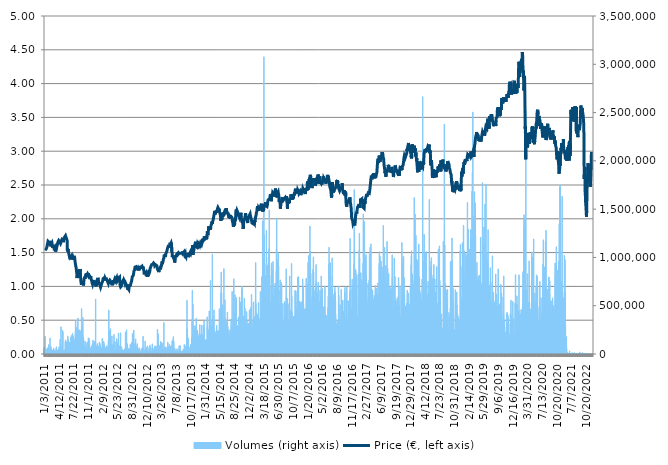
| Category | Volumes (right axis) |
|---|---|
| 1/3/11 | 57810.176 |
| 1/4/11 | 41521.826 |
| 1/5/11 | 73502.117 |
| 1/6/11 | 15096.544 |
| 1/7/11 | 47100.125 |
| 1/10/11 | 59739.139 |
| 1/11/11 | 182088.08 |
| 1/12/11 | 23761.185 |
| 1/13/11 | 38979.239 |
| 1/14/11 | 40158.894 |
| 1/17/11 | 49718.655 |
| 1/18/11 | 23423.996 |
| 1/19/11 | 47818.044 |
| 1/20/11 | 35039.293 |
| 1/21/11 | 40614.555 |
| 1/24/11 | 27457.1 |
| 1/25/11 | 55677.684 |
| 1/26/11 | 12575.222 |
| 1/27/11 | 15343.614 |
| 1/28/11 | 47602.364 |
| 1/31/11 | 68024.063 |
| 2/1/11 | 47867.66 |
| 2/2/11 | 63451.255 |
| 2/3/11 | 51740.776 |
| 2/4/11 | 97541.761 |
| 2/7/11 | 72814.575 |
| 2/8/11 | 25965.57 |
| 2/9/11 | 42696.418 |
| 2/10/11 | 12645.09 |
| 2/11/11 | 57954.975 |
| 2/14/11 | 165105.101 |
| 2/15/11 | 17365.735 |
| 2/16/11 | 20222.221 |
| 2/17/11 | 29016.472 |
| 2/18/11 | 7947.735 |
| 2/21/11 | 74292.941 |
| 2/22/11 | 47494.018 |
| 2/23/11 | 23543.481 |
| 2/24/11 | 17756.59 |
| 2/25/11 | 28083.886 |
| 2/28/11 | 25432.954 |
| 3/1/11 | 26374.652 |
| 3/2/11 | 41559.291 |
| 3/3/11 | 34167.462 |
| 3/4/11 | 14073.839 |
| 3/7/11 | 21689.448 |
| 3/8/11 | 20088.56 |
| 3/9/11 | 29209.874 |
| 3/10/11 | 59475.869 |
| 3/11/11 | 11088.756 |
| 3/14/11 | 26539.703 |
| 3/15/11 | 34970.438 |
| 3/16/11 | 24125.714 |
| 3/17/11 | 14298.632 |
| 3/18/11 | 8283.911 |
| 3/21/11 | 33834.324 |
| 3/22/11 | 17667.483 |
| 3/23/11 | 5265.412 |
| 3/24/11 | 31788.914 |
| 3/25/11 | 19543.793 |
| 3/28/11 | 59484.982 |
| 3/29/11 | 74784.042 |
| 3/30/11 | 35554.696 |
| 3/31/11 | 32231.411 |
| 4/1/11 | 20441.95 |
| 4/4/11 | 37039.137 |
| 4/5/11 | 8369.98 |
| 4/6/11 | 3499.474 |
| 4/7/11 | 9266.113 |
| 4/8/11 | 46891.534 |
| 4/11/11 | 41811.423 |
| 4/12/11 | 22921.757 |
| 4/13/11 | 7091.093 |
| 4/14/11 | 26754.37 |
| 4/15/11 | 74399.262 |
| 4/18/11 | 33343.223 |
| 4/19/11 | 27151.301 |
| 4/20/11 | 40271.29 |
| 4/21/11 | 14298.632 |
| 4/26/11 | 152664.552 |
| 4/27/11 | 22356.738 |
| 4/28/11 | 50080.146 |
| 4/29/11 | 16146.589 |
| 5/2/11 | 282318.239 |
| 5/3/11 | 65652.602 |
| 5/4/11 | 76438.597 |
| 5/5/11 | 10684.736 |
| 5/6/11 | 47560.848 |
| 5/9/11 | 15454.997 |
| 5/10/11 | 90691.663 |
| 5/11/11 | 11564.668 |
| 5/12/11 | 244919.637 |
| 5/13/11 | 227125.581 |
| 5/16/11 | 25708.375 |
| 5/17/11 | 33398.915 |
| 5/18/11 | 23845.229 |
| 5/19/11 | 30040.189 |
| 5/20/11 | 17675.584 |
| 5/23/11 | 10580.441 |
| 5/24/11 | 44570.702 |
| 5/25/11 | 33851.538 |
| 5/26/11 | 20950.265 |
| 5/27/11 | 28601.314 |
| 5/30/11 | 33465.745 |
| 5/31/11 | 124794.32 |
| 6/1/11 | 146104.051 |
| 6/2/11 | 87123.333 |
| 6/3/11 | 36078.199 |
| 6/6/11 | 120464.531 |
| 6/7/11 | 120870.575 |
| 6/8/11 | 104821.194 |
| 6/9/11 | 83261.356 |
| 6/10/11 | 39356.931 |
| 6/13/11 | 134052.332 |
| 6/14/11 | 88942.938 |
| 6/15/11 | 113842.262 |
| 6/16/11 | 184251.962 |
| 6/17/11 | 151268.205 |
| 6/20/11 | 110017.751 |
| 6/21/11 | 134063.47 |
| 6/22/11 | 118226.731 |
| 6/23/11 | 68666.038 |
| 6/24/11 | 100804.292 |
| 6/27/11 | 121006.261 |
| 6/28/11 | 99007.976 |
| 6/29/11 | 92803.903 |
| 6/30/11 | 121770.758 |
| 7/1/11 | 82192.072 |
| 7/4/11 | 105704.163 |
| 7/5/11 | 81078.235 |
| 7/6/11 | 54056.544 |
| 7/7/11 | 173626.968 |
| 7/8/11 | 122372.23 |
| 7/11/11 | 97535.686 |
| 7/12/11 | 192859.899 |
| 7/13/11 | 145202.855 |
| 7/14/11 | 139645.82 |
| 7/15/11 | 158437.266 |
| 7/18/11 | 72252.594 |
| 7/19/11 | 213791.937 |
| 7/20/11 | 82748.991 |
| 7/21/11 | 175198.491 |
| 7/22/11 | 188015.719 |
| 7/25/11 | 13537.172 |
| 7/26/11 | 173471.031 |
| 7/27/11 | 162735.665 |
| 7/28/11 | 144195.339 |
| 7/29/11 | 106070.717 |
| 8/1/11 | 140707.003 |
| 8/2/11 | 97033.447 |
| 8/3/11 | 75157.684 |
| 8/4/11 | 75309.571 |
| 8/5/11 | 128556.052 |
| 8/8/11 | 232883.107 |
| 8/9/11 | 343612.701 |
| 8/10/11 | 287956.281 |
| 8/11/11 | 175743.259 |
| 8/12/11 | 70774.228 |
| 8/16/11 | 153397.659 |
| 8/17/11 | 146626.542 |
| 8/18/11 | 198374.405 |
| 8/19/11 | 270422.458 |
| 8/22/11 | 57300.848 |
| 8/23/11 | 80459.549 |
| 8/24/11 | 220735.193 |
| 8/25/11 | 372333.499 |
| 8/26/11 | 145840.78 |
| 8/29/11 | 124143.231 |
| 8/30/11 | 205616.372 |
| 8/31/11 | 182563.992 |
| 9/1/11 | 246460.782 |
| 9/2/11 | 78729.051 |
| 9/5/11 | 129746.845 |
| 9/6/11 | 249851.91 |
| 9/7/11 | 139357.235 |
| 9/8/11 | 186928.209 |
| 9/9/11 | 234225.787 |
| 9/12/11 | 211242.263 |
| 9/13/11 | 237912.588 |
| 9/14/11 | 87047.39 |
| 9/15/11 | 239808.136 |
| 9/16/11 | 144456.584 |
| 9/19/11 | 171045.903 |
| 9/20/11 | 469721.348 |
| 9/21/11 | 231239.691 |
| 9/22/11 | 206975.254 |
| 9/23/11 | 165161.805 |
| 9/26/11 | 283697.372 |
| 9/27/11 | 191180.03 |
| 9/28/11 | 379749.63 |
| 9/29/11 | 73630.714 |
| 9/30/11 | 173677.597 |
| 10/3/11 | 163399.917 |
| 10/4/11 | 140981.412 |
| 10/5/11 | 40321.919 |
| 10/6/11 | 59455.617 |
| 10/7/11 | 45138.759 |
| 10/10/11 | 57406.157 |
| 10/11/11 | 52628.808 |
| 10/12/11 | 81136.965 |
| 10/13/11 | 131710.236 |
| 10/14/11 | 90788.87 |
| 10/17/11 | 51648.631 |
| 10/18/11 | 67187.672 |
| 10/19/11 | 19317.987 |
| 10/20/11 | 58248.623 |
| 10/21/11 | 35618.488 |
| 10/24/11 | 57754.484 |
| 10/25/11 | 26599.445 |
| 10/26/11 | 116907.34 |
| 10/27/11 | 46144.25 |
| 10/28/11 | 55582.501 |
| 10/31/11 | 54383.608 |
| 11/1/11 | 124299.169 |
| 11/2/11 | 78134.667 |
| 11/3/11 | 121794.047 |
| 11/4/11 | 166739.404 |
| 11/7/11 | 58598.975 |
| 11/8/11 | 63213.299 |
| 11/9/11 | 161805.105 |
| 11/10/11 | 97568.088 |
| 11/11/11 | 141349.991 |
| 11/14/11 | 55867.036 |
| 11/15/11 | 9383.572 |
| 11/16/11 | 41327.41 |
| 11/17/11 | 26794.873 |
| 11/18/11 | 24238.11 |
| 11/21/11 | 46114.885 |
| 11/22/11 | 33223.739 |
| 11/23/11 | 66263.188 |
| 11/24/11 | 75870.54 |
| 11/25/11 | 55754.64 |
| 11/28/11 | 80532.455 |
| 11/29/11 | 50886.159 |
| 11/30/11 | 40100.164 |
| 12/1/11 | 101053.386 |
| 12/2/11 | 37056.351 |
| 12/5/11 | 97125.591 |
| 12/6/11 | 143183.772 |
| 12/7/11 | 21087.976 |
| 12/8/11 | 84060.281 |
| 12/9/11 | 90785.832 |
| 12/12/11 | 101059.462 |
| 12/13/11 | 74655.445 |
| 12/14/11 | 131726.438 |
| 12/15/11 | 119595.738 |
| 12/16/11 | 73361.368 |
| 12/19/11 | 83709.928 |
| 12/20/11 | 25208.161 |
| 12/21/11 | 77676.981 |
| 12/22/11 | 25248.664 |
| 12/23/11 | 568786.029 |
| 12/27/11 | 23658.915 |
| 12/28/11 | 34993.727 |
| 12/29/11 | 82946.444 |
| 12/30/11 | 42154.688 |
| 1/2/12 | 16270.124 |
| 1/3/12 | 22774.933 |
| 1/4/12 | 27691.005 |
| 1/5/12 | 107496.428 |
| 1/6/12 | 20130.076 |
| 1/9/12 | 41516.763 |
| 1/10/12 | 17711.024 |
| 1/11/12 | 12582.31 |
| 1/12/12 | 78458.692 |
| 1/13/12 | 49304.51 |
| 1/16/12 | 20879.385 |
| 1/17/12 | 18837.012 |
| 1/18/12 | 68737.931 |
| 1/19/12 | 121574.318 |
| 1/20/12 | 62850.795 |
| 1/23/12 | 114857.879 |
| 1/24/12 | 69948.976 |
| 1/25/12 | 95677.603 |
| 1/26/12 | 52611.594 |
| 1/27/12 | 24564.161 |
| 1/30/12 | 63908.941 |
| 1/31/12 | 29260.503 |
| 2/1/12 | 42514.153 |
| 2/2/12 | 32090.662 |
| 2/3/12 | 56366.238 |
| 2/6/12 | 58464.302 |
| 2/7/12 | 58306.34 |
| 2/8/12 | 161450.702 |
| 2/9/12 | 38378.78 |
| 2/10/12 | 71027.373 |
| 2/13/12 | 59169.057 |
| 2/14/12 | 36478.168 |
| 2/15/12 | 69005.252 |
| 2/16/12 | 100674.682 |
| 2/17/12 | 132044.387 |
| 2/20/12 | 111174.116 |
| 2/21/12 | 33132.606 |
| 2/22/12 | 91616.147 |
| 2/23/12 | 84486.577 |
| 2/24/12 | 63055.336 |
| 2/27/12 | 44946.369 |
| 2/28/12 | 11637.574 |
| 2/29/12 | 40154.844 |
| 3/1/12 | 30092.843 |
| 3/2/12 | 36318.181 |
| 3/5/12 | 70004.668 |
| 3/6/12 | 59068.812 |
| 3/7/12 | 32254.7 |
| 3/8/12 | 36944.967 |
| 3/9/12 | 86515.786 |
| 3/12/12 | 47652.993 |
| 3/13/12 | 57993.453 |
| 3/14/12 | 21627.681 |
| 3/15/12 | 63715.538 |
| 3/16/12 | 20907.737 |
| 3/19/12 | 34545.154 |
| 3/20/12 | 73555.783 |
| 3/21/12 | 138539.071 |
| 3/22/12 | 86671.723 |
| 3/23/12 | 455555.364 |
| 3/26/12 | 130332.116 |
| 3/27/12 | 128883.115 |
| 3/28/12 | 198316.688 |
| 3/29/12 | 94307.583 |
| 3/30/12 | 236920.26 |
| 4/2/12 | 210323.853 |
| 4/3/12 | 222305.704 |
| 4/4/12 | 261787.182 |
| 4/5/12 | 52214.663 |
| 4/10/12 | 80032.241 |
| 4/11/12 | 102097.355 |
| 4/12/12 | 74168.394 |
| 4/13/12 | 49037.189 |
| 4/16/12 | 85783.691 |
| 4/17/12 | 186174.85 |
| 4/18/12 | 92412.035 |
| 4/19/12 | 70033.02 |
| 4/20/12 | 45486.073 |
| 4/23/12 | 56310.546 |
| 4/24/12 | 95206.753 |
| 4/25/12 | 35415.973 |
| 4/26/12 | 56386.489 |
| 4/27/12 | 75487.785 |
| 4/30/12 | 58588.849 |
| 5/2/12 | 202105.76 |
| 5/3/12 | 101399.688 |
| 5/4/12 | 129526.103 |
| 5/7/12 | 28195.27 |
| 5/8/12 | 36200.722 |
| 5/9/12 | 47753.238 |
| 5/10/12 | 28596.251 |
| 5/11/12 | 29327.333 |
| 5/14/12 | 36981.42 |
| 5/15/12 | 32857.185 |
| 5/16/12 | 126063.082 |
| 5/17/12 | 79498.611 |
| 5/18/12 | 42377.455 |
| 5/21/12 | 158883.814 |
| 5/22/12 | 111251.072 |
| 5/23/12 | 47411.999 |
| 5/24/12 | 27874.282 |
| 5/25/12 | 43415.349 |
| 5/28/12 | 28715.736 |
| 5/29/12 | 116195.497 |
| 5/30/12 | 63169.758 |
| 5/31/12 | 148244.643 |
| 6/1/12 | 216327.436 |
| 6/4/12 | 43793.041 |
| 6/5/12 | 60948.159 |
| 6/6/12 | 51442.065 |
| 6/7/12 | 84871.357 |
| 6/8/12 | 46767.999 |
| 6/11/12 | 46884.445 |
| 6/12/12 | 36365.772 |
| 6/13/12 | 58158.503 |
| 6/14/12 | 30339.913 |
| 6/15/12 | 219553.513 |
| 6/18/12 | 66625.691 |
| 6/19/12 | 78044.547 |
| 6/20/12 | 34991.702 |
| 6/21/12 | 40014.095 |
| 6/22/12 | 70838.021 |
| 6/25/12 | 36591.577 |
| 6/26/12 | 45690.615 |
| 6/27/12 | 940.686 |
| 6/28/12 | 7319.936 |
| 6/29/12 | 40612.529 |
| 7/2/12 | 34461.11 |
| 7/3/12 | 13481.48 |
| 7/4/12 | 8306.188 |
| 7/5/12 | 22003.348 |
| 7/6/12 | 2957.744 |
| 7/9/12 | 41642.323 |
| 7/10/12 | 19657.201 |
| 7/11/12 | 3351.637 |
| 7/12/12 | 22097.517 |
| 7/13/12 | 53862.129 |
| 7/16/12 | 10270.592 |
| 7/17/12 | 15221.092 |
| 7/18/12 | 14213.575 |
| 7/19/12 | 227581.242 |
| 7/20/12 | 23753.085 |
| 7/23/12 | 65933.087 |
| 7/24/12 | 94220.501 |
| 7/25/12 | 88262.485 |
| 7/26/12 | 251402.169 |
| 7/27/12 | 14785.683 |
| 7/30/12 | 13016.707 |
| 7/31/12 | 32154.455 |
| 8/1/12 | 105543.163 |
| 8/2/12 | 38125.635 |
| 8/3/12 | 17297.892 |
| 8/6/12 | 27943.138 |
| 8/7/12 | 59580.164 |
| 8/8/12 | 30487.749 |
| 8/9/12 | 34843.865 |
| 8/10/12 | 34888.419 |
| 8/13/12 | 13566.537 |
| 8/14/12 | 37852.238 |
| 8/16/12 | 30583.944 |
| 8/17/12 | 54538.532 |
| 8/20/12 | 26316.935 |
| 8/21/12 | 24307.978 |
| 8/22/12 | 98847.989 |
| 8/23/12 | 18783.346 |
| 8/24/12 | 7004.011 |
| 8/27/12 | 61362.304 |
| 8/28/12 | 90060.826 |
| 8/29/12 | 98361.951 |
| 8/30/12 | 112626.155 |
| 8/31/12 | 119537.008 |
| 9/3/12 | 98064.252 |
| 9/4/12 | 20738.636 |
| 9/5/12 | 23991.041 |
| 9/6/12 | 212346.987 |
| 9/7/12 | 189974.048 |
| 9/10/12 | 127172.869 |
| 9/11/12 | 76939.823 |
| 9/12/12 | 132514.224 |
| 9/13/12 | 72000.462 |
| 9/14/12 | 247186.802 |
| 9/17/12 | 81323.279 |
| 9/18/12 | 97563.025 |
| 9/19/12 | 46346.766 |
| 9/20/12 | 25535.224 |
| 9/21/12 | 14697.588 |
| 9/24/12 | 30277.133 |
| 9/25/12 | 118784.662 |
| 9/26/12 | 91535.141 |
| 9/27/12 | 155738.742 |
| 9/28/12 | 89134.316 |
| 10/1/12 | 36821.433 |
| 10/2/12 | 46143.237 |
| 10/3/12 | 33127.543 |
| 10/4/12 | 65748.797 |
| 10/5/12 | 4094.871 |
| 10/8/12 | 32883.512 |
| 10/9/12 | 106503.088 |
| 10/10/12 | 78132.642 |
| 10/11/12 | 42322.776 |
| 10/12/12 | 46509.791 |
| 10/15/12 | 13032.908 |
| 10/16/12 | 16392.646 |
| 10/17/12 | 48057.012 |
| 10/18/12 | 50918.561 |
| 10/19/12 | 30220.428 |
| 10/22/12 | 18765.119 |
| 10/23/12 | 63164.695 |
| 10/24/12 | 56976.823 |
| 10/25/12 | 37323.672 |
| 10/26/12 | 18736.767 |
| 10/29/12 | 19997.428 |
| 10/30/12 | 15683.84 |
| 10/31/12 | 18195.037 |
| 11/1/12 | 13730.575 |
| 11/2/12 | 12728.121 |
| 11/5/12 | 31805.115 |
| 11/6/12 | 6635.432 |
| 11/7/12 | 51402.574 |
| 11/8/12 | 55070.136 |
| 11/9/12 | 25458.268 |
| 11/12/12 | 7173.112 |
| 11/13/12 | 22854.927 |
| 11/14/12 | 68439.22 |
| 11/15/12 | 37294.307 |
| 11/16/12 | 184167.918 |
| 11/19/12 | 18592.981 |
| 11/20/12 | 48540.013 |
| 11/21/12 | 33159.946 |
| 11/22/12 | 19020.289 |
| 11/23/12 | 29411.378 |
| 11/26/12 | 40880.863 |
| 11/27/12 | 34566.419 |
| 11/28/12 | 41690.926 |
| 11/29/12 | 35424.073 |
| 11/30/12 | 133297.961 |
| 12/3/12 | 17651.282 |
| 12/4/12 | 12863.807 |
| 12/5/12 | 25679.01 |
| 12/6/12 | 32850.097 |
| 12/7/12 | 12670.404 |
| 12/10/12 | 19830.352 |
| 12/11/12 | 67739.528 |
| 12/12/12 | 44751.954 |
| 12/13/12 | 37520.112 |
| 12/14/12 | 27964.402 |
| 12/17/12 | 83604.62 |
| 12/18/12 | 61696.455 |
| 12/19/12 | 35646.841 |
| 12/20/12 | 9011.956 |
| 12/21/12 | 27994.779 |
| 12/27/12 | 17000.193 |
| 12/28/12 | 28112.238 |
| 1/2/13 | 23608.286 |
| 1/3/13 | 12156.014 |
| 1/4/13 | 71556.952 |
| 1/7/13 | 46099.697 |
| 1/8/13 | 68899.944 |
| 1/9/13 | 71067.876 |
| 1/10/13 | 92718.846 |
| 1/11/13 | 31856.756 |
| 1/14/13 | 52713.864 |
| 1/15/13 | 26821.2 |
| 1/16/13 | 10219.963 |
| 1/17/13 | 8352.766 |
| 1/18/13 | 17094.363 |
| 1/21/13 | 24353.544 |
| 1/22/13 | 31451.725 |
| 1/23/13 | 30132.334 |
| 1/24/13 | 60129.995 |
| 1/25/13 | 104695.634 |
| 1/28/13 | 31987.379 |
| 1/29/13 | 29835.648 |
| 1/30/13 | 32892.625 |
| 1/31/13 | 56006.772 |
| 2/1/13 | 39111.887 |
| 2/4/13 | 20558.397 |
| 2/5/13 | 13957.393 |
| 2/6/13 | 20720.41 |
| 2/7/13 | 28916.226 |
| 2/8/13 | 20384.233 |
| 2/11/13 | 24193.557 |
| 2/12/13 | 81918.676 |
| 2/13/13 | 70697.272 |
| 2/14/13 | 48682.786 |
| 2/15/13 | 66298.628 |
| 2/18/13 | 82391.55 |
| 2/19/13 | 46663.703 |
| 2/20/13 | 69660.391 |
| 2/21/13 | 29106.591 |
| 2/22/13 | 39700.196 |
| 2/25/13 | 17185.495 |
| 2/26/13 | 37121.156 |
| 2/27/13 | 52347.311 |
| 2/28/13 | 91826.764 |
| 3/1/13 | 255566.908 |
| 3/4/13 | 96491.717 |
| 3/5/13 | 192114.64 |
| 3/6/13 | 210670.155 |
| 3/7/13 | 23247.808 |
| 3/8/13 | 18013.785 |
| 3/11/13 | 11798.574 |
| 3/12/13 | 12930.637 |
| 3/13/13 | 13785.254 |
| 3/14/13 | 24897.299 |
| 3/15/13 | 42247.845 |
| 3/18/13 | 87388.629 |
| 3/19/13 | 65969.54 |
| 3/20/13 | 33396.89 |
| 3/21/13 | 65968.527 |
| 3/22/13 | 108981.882 |
| 3/25/13 | 130042.518 |
| 3/26/13 | 115693.257 |
| 3/27/13 | 34858.041 |
| 3/28/13 | 39260.736 |
| 4/2/13 | 45871.866 |
| 4/3/13 | 99727.92 |
| 4/4/13 | 114518.665 |
| 4/5/13 | 33407.015 |
| 4/8/13 | 41274.756 |
| 4/9/13 | 44135.293 |
| 4/10/13 | 46298.162 |
| 4/11/13 | 32172.681 |
| 4/12/13 | 53695.054 |
| 4/15/13 | 9919.227 |
| 4/16/13 | 3169.373 |
| 4/17/13 | 326397.84 |
| 4/18/13 | 17087.275 |
| 4/19/13 | 50929.7 |
| 4/22/13 | 36226.036 |
| 4/23/13 | 44597.029 |
| 4/24/13 | 14962.884 |
| 4/25/13 | 73282.387 |
| 4/26/13 | 15809.4 |
| 4/29/13 | 10478.17 |
| 4/30/13 | 37821.861 |
| 5/2/13 | 69719.121 |
| 5/3/13 | 4539.393 |
| 5/6/13 | 11436.07 |
| 5/7/13 | 43754.563 |
| 5/8/13 | 34698.054 |
| 5/9/13 | 8126.961 |
| 5/10/13 | 42249.87 |
| 5/13/13 | 69591.536 |
| 5/14/13 | 56484.71 |
| 5/15/13 | 122115.035 |
| 5/16/13 | 78913.34 |
| 5/17/13 | 34697.041 |
| 5/20/13 | 53805.425 |
| 5/21/13 | 37744.905 |
| 5/22/13 | 62877.122 |
| 5/23/13 | 74895.426 |
| 5/24/13 | 57169.213 |
| 5/27/13 | 101040.223 |
| 5/28/13 | 78993.334 |
| 5/29/13 | 17911.515 |
| 5/30/13 | 40012.07 |
| 5/31/13 | 69500.404 |
| 6/3/13 | 82552.55 |
| 6/4/13 | 40012.07 |
| 6/5/13 | 5839.545 |
| 6/6/13 | 44943.331 |
| 6/7/13 | 81633.128 |
| 6/10/13 | 40691.511 |
| 6/11/13 | 30141.447 |
| 6/12/13 | 18636.522 |
| 6/13/13 | 135734.226 |
| 6/14/13 | 97843.51 |
| 6/17/13 | 66478.867 |
| 6/18/13 | 92859.595 |
| 6/19/13 | 24813.255 |
| 6/20/13 | 152911.621 |
| 6/21/13 | 179340.953 |
| 6/24/13 | 52050.625 |
| 6/25/13 | 129244.606 |
| 6/26/13 | 56521.162 |
| 6/27/13 | 49049.34 |
| 6/28/13 | 20672.818 |
| 7/1/13 | 20792.303 |
| 7/2/13 | 15111.733 |
| 7/3/13 | 54269.186 |
| 7/4/13 | 21854.498 |
| 7/5/13 | 19015.226 |
| 7/8/13 | 30088.793 |
| 7/9/13 | 5855.746 |
| 7/10/13 | 5855.746 |
| 7/11/13 | 25902.79 |
| 7/12/13 | 15917.746 |
| 7/15/13 | 37417.842 |
| 7/16/13 | 19930.598 |
| 7/17/13 | 54561.822 |
| 7/18/13 | 38706.855 |
| 7/19/13 | 34903.608 |
| 7/22/13 | 15283.872 |
| 7/23/13 | 26493.124 |
| 7/24/13 | 20711.296 |
| 7/25/13 | 4529.267 |
| 7/26/13 | 4865.443 |
| 7/29/13 | 4865.443 |
| 7/30/13 | 23689.292 |
| 7/31/13 | 83927.633 |
| 8/1/13 | 52927.519 |
| 8/2/13 | 28557.773 |
| 8/5/13 | 37864.389 |
| 8/6/13 | 21925.379 |
| 8/7/13 | 88104.522 |
| 8/8/13 | 34042.915 |
| 8/9/13 | 21642.869 |
| 8/12/13 | 16202.281 |
| 8/13/13 | 30004.749 |
| 8/14/13 | 28677.258 |
| 8/16/13 | 24761.614 |
| 8/19/13 | 9706.585 |
| 8/20/13 | 13568.562 |
| 8/21/13 | 13671.845 |
| 8/22/13 | 24746.425 |
| 8/23/13 | 1916.813 |
| 8/26/13 | 14047.512 |
| 8/27/13 | 20237.409 |
| 8/28/13 | 32068.386 |
| 8/29/13 | 50720.096 |
| 8/30/13 | 39207.069 |
| 9/2/13 | 11216.341 |
| 9/3/13 | 24433.538 |
| 9/4/13 | 8369.98 |
| 9/6/13 | 98808.498 |
| 9/9/13 | 29962.221 |
| 9/10/13 | 49468.548 |
| 9/11/13 | 87077.767 |
| 9/12/13 | 24837.557 |
| 9/13/13 | 20718.384 |
| 9/16/13 | 22021.574 |
| 9/17/13 | 73266.186 |
| 9/18/13 | 21239.863 |
| 9/19/13 | 80728.895 |
| 9/20/13 | 18049.226 |
| 9/23/13 | 29886.277 |
| 9/24/13 | 123188.369 |
| 9/25/13 | 556233.084 |
| 9/26/13 | 258331.249 |
| 9/27/13 | 198440.223 |
| 9/30/13 | 77173.729 |
| 10/1/13 | 18736.767 |
| 10/2/13 | 21532.498 |
| 10/3/13 | 48000.308 |
| 10/4/13 | 161788.904 |
| 10/7/13 | 41674.725 |
| 10/8/13 | 24141.915 |
| 10/9/13 | 66089.024 |
| 10/10/13 | 56613.307 |
| 10/11/13 | 49197.177 |
| 10/14/13 | 47336.056 |
| 10/15/13 | 40469.756 |
| 10/16/13 | 70266.926 |
| 10/17/13 | 59857.611 |
| 10/18/13 | 57379.83 |
| 10/21/13 | 95056.892 |
| 10/22/13 | 95010.313 |
| 10/23/13 | 33078.94 |
| 10/24/13 | 108493.819 |
| 10/25/13 | 62456.902 |
| 10/28/13 | 172282 |
| 10/29/13 | 118730 |
| 10/30/13 | 355929 |
| 10/31/13 | 660242 |
| 11/1/13 | 182930 |
| 11/4/13 | 147508 |
| 11/5/13 | 515184 |
| 11/6/13 | 155033 |
| 11/7/13 | 205618 |
| 11/8/13 | 87253 |
| 11/11/13 | 81127 |
| 11/12/13 | 293929 |
| 11/13/13 | 109362 |
| 11/14/13 | 131128 |
| 11/15/13 | 258490 |
| 11/18/13 | 60639 |
| 11/19/13 | 121122 |
| 11/20/13 | 18398 |
| 11/21/13 | 292013 |
| 11/22/13 | 227954 |
| 11/25/13 | 30002 |
| 11/26/13 | 18817 |
| 11/27/13 | 371686 |
| 11/28/13 | 208540 |
| 11/29/13 | 28039 |
| 12/2/13 | 43349 |
| 12/3/13 | 90168 |
| 12/4/13 | 247769 |
| 12/5/13 | 235844 |
| 12/6/13 | 55570 |
| 12/9/13 | 66388 |
| 12/10/13 | 56080 |
| 12/11/13 | 53449 |
| 12/12/13 | 17458 |
| 12/13/13 | 137747 |
| 12/16/13 | 186070 |
| 12/17/13 | 205598 |
| 12/18/13 | 106411 |
| 12/19/13 | 150755 |
| 12/20/13 | 303405 |
| 12/23/13 | 149468 |
| 12/27/13 | 64605 |
| 12/30/13 | 203718 |
| 1/2/14 | 143813 |
| 1/3/14 | 181278 |
| 1/6/14 | 53127 |
| 1/7/14 | 112172 |
| 1/8/14 | 146000 |
| 1/9/14 | 144802 |
| 1/10/14 | 299932 |
| 1/13/14 | 80159 |
| 1/14/14 | 46130 |
| 1/15/14 | 55139 |
| 1/16/14 | 200453 |
| 1/17/14 | 63411 |
| 1/20/14 | 106769 |
| 1/21/14 | 152896 |
| 1/22/14 | 87702 |
| 1/23/14 | 242672 |
| 1/24/14 | 291576 |
| 1/27/14 | 341744 |
| 1/28/14 | 49290 |
| 1/29/14 | 75409 |
| 1/30/14 | 98187 |
| 1/31/14 | 44833 |
| 2/3/14 | 106421 |
| 2/4/14 | 104136 |
| 2/5/14 | 148834 |
| 2/6/14 | 82960 |
| 2/7/14 | 143314 |
| 2/10/14 | 111315 |
| 2/11/14 | 20637 |
| 2/12/14 | 127386 |
| 2/13/14 | 39737 |
| 2/14/14 | 143131 |
| 2/17/14 | 384354 |
| 2/18/14 | 282611 |
| 2/19/14 | 95627 |
| 2/20/14 | 109663 |
| 2/21/14 | 221309 |
| 2/24/14 | 117745 |
| 2/25/14 | 52042 |
| 2/26/14 | 109193 |
| 2/27/14 | 255109 |
| 2/28/14 | 121743 |
| 3/3/14 | 445541 |
| 3/4/14 | 78211 |
| 3/5/14 | 267858 |
| 3/6/14 | 176545 |
| 3/7/14 | 229162 |
| 3/10/14 | 108201 |
| 3/11/14 | 761188 |
| 3/12/14 | 151088 |
| 3/13/14 | 287019 |
| 3/14/14 | 105889 |
| 3/17/14 | 89445 |
| 3/18/14 | 152571 |
| 3/19/14 | 262570 |
| 3/20/14 | 285797 |
| 3/21/14 | 336331 |
| 3/24/14 | 1034074 |
| 3/25/14 | 348379 |
| 3/26/14 | 386215 |
| 3/27/14 | 244730 |
| 3/28/14 | 361444 |
| 3/31/14 | 211072 |
| 4/1/14 | 363692 |
| 4/2/14 | 130568 |
| 4/3/14 | 455498 |
| 4/4/14 | 212464 |
| 4/7/14 | 150705 |
| 4/8/14 | 248203 |
| 4/9/14 | 89018 |
| 4/10/14 | 179270 |
| 4/11/14 | 62495 |
| 4/14/14 | 154777 |
| 4/15/14 | 224772 |
| 4/16/14 | 72518 |
| 4/17/14 | 196293 |
| 4/22/14 | 105991 |
| 4/23/14 | 198700 |
| 4/24/14 | 297377 |
| 4/25/14 | 139697 |
| 4/28/14 | 96017 |
| 4/29/14 | 239701 |
| 4/30/14 | 181775 |
| 5/2/14 | 211922 |
| 5/5/14 | 129556 |
| 5/6/14 | 63719 |
| 5/7/14 | 157971 |
| 5/8/14 | 107667 |
| 5/9/14 | 242798 |
| 5/12/14 | 141290 |
| 5/13/14 | 153298 |
| 5/14/14 | 468376 |
| 5/15/14 | 188696 |
| 5/16/14 | 406640 |
| 5/19/14 | 444968 |
| 5/20/14 | 376274 |
| 5/21/14 | 209306 |
| 5/22/14 | 87942 |
| 5/23/14 | 89435 |
| 5/26/14 | 632897 |
| 5/27/14 | 847923 |
| 5/28/14 | 362676 |
| 5/29/14 | 629563 |
| 5/30/14 | 175072 |
| 6/2/14 | 169456 |
| 6/3/14 | 259312 |
| 6/4/14 | 508436 |
| 6/5/14 | 146192 |
| 6/6/14 | 354158 |
| 6/9/14 | 64469 |
| 6/10/14 | 247834 |
| 6/11/14 | 218354 |
| 6/12/14 | 157116 |
| 6/13/14 | 883713 |
| 6/16/14 | 280941 |
| 6/17/14 | 180329 |
| 6/18/14 | 210398 |
| 6/19/14 | 182182 |
| 6/20/14 | 561537 |
| 6/23/14 | 59638 |
| 6/24/14 | 371837 |
| 6/25/14 | 255086 |
| 6/26/14 | 156256 |
| 6/27/14 | 108406 |
| 6/30/14 | 101573 |
| 7/1/14 | 266288 |
| 7/2/14 | 252043 |
| 7/3/14 | 335015 |
| 7/4/14 | 122351 |
| 7/7/14 | 35862 |
| 7/8/14 | 434736 |
| 7/9/14 | 176263 |
| 7/10/14 | 284211 |
| 7/11/14 | 244006 |
| 7/14/14 | 114800 |
| 7/15/14 | 93926 |
| 7/16/14 | 157982 |
| 7/17/14 | 207506 |
| 7/18/14 | 150269 |
| 7/21/14 | 155987 |
| 7/22/14 | 107774 |
| 7/23/14 | 143093 |
| 7/24/14 | 250738 |
| 7/25/14 | 144591 |
| 7/28/14 | 46761 |
| 7/29/14 | 198434 |
| 7/30/14 | 60462 |
| 7/31/14 | 158058 |
| 8/1/14 | 362715 |
| 8/4/14 | 287202 |
| 8/5/14 | 221398 |
| 8/6/14 | 293385 |
| 8/7/14 | 272407 |
| 8/8/14 | 647359 |
| 8/11/14 | 143750 |
| 8/12/14 | 152524 |
| 8/13/14 | 117204 |
| 8/14/14 | 182897 |
| 8/18/14 | 221017 |
| 8/19/14 | 214493 |
| 8/20/14 | 371511 |
| 8/21/14 | 778327 |
| 8/22/14 | 422619 |
| 8/25/14 | 328496 |
| 8/26/14 | 320737 |
| 8/27/14 | 410903 |
| 8/28/14 | 365991 |
| 8/29/14 | 612731 |
| 9/1/14 | 182001 |
| 9/2/14 | 249011 |
| 9/3/14 | 458806 |
| 9/4/14 | 294265 |
| 9/5/14 | 581653 |
| 9/8/14 | 581534 |
| 9/9/14 | 206171 |
| 9/10/14 | 145981 |
| 9/11/14 | 187291 |
| 9/12/14 | 104830 |
| 9/15/14 | 108117 |
| 9/16/14 | 293756 |
| 9/17/14 | 85812 |
| 9/18/14 | 226099 |
| 9/19/14 | 144947 |
| 9/22/14 | 56448 |
| 9/23/14 | 383243 |
| 9/24/14 | 134310 |
| 9/25/14 | 316122 |
| 9/26/14 | 150106 |
| 9/29/14 | 121655 |
| 9/30/14 | 589966 |
| 10/1/14 | 547737 |
| 10/2/14 | 376489 |
| 10/3/14 | 120631 |
| 10/6/14 | 253753 |
| 10/7/14 | 464267 |
| 10/8/14 | 530657 |
| 10/9/14 | 516809 |
| 10/10/14 | 504064 |
| 10/13/14 | 469124 |
| 10/14/14 | 454859 |
| 10/15/14 | 674116 |
| 10/16/14 | 699689 |
| 10/17/14 | 416948 |
| 10/20/14 | 302022 |
| 10/21/14 | 350427 |
| 10/22/14 | 301958 |
| 10/23/14 | 217696 |
| 10/24/14 | 392159 |
| 10/27/14 | 194851 |
| 10/28/14 | 199921 |
| 10/29/14 | 123656 |
| 10/30/14 | 321917 |
| 10/31/14 | 577676 |
| 11/3/14 | 273656 |
| 11/4/14 | 346740 |
| 11/5/14 | 473535 |
| 11/6/14 | 167598 |
| 11/7/14 | 211614 |
| 11/10/14 | 332761 |
| 11/11/14 | 181136 |
| 11/12/14 | 229214 |
| 11/13/14 | 177843 |
| 11/14/14 | 441695 |
| 11/17/14 | 432668 |
| 11/18/14 | 239593 |
| 11/19/14 | 337135 |
| 11/20/14 | 135782 |
| 11/21/14 | 122809 |
| 11/24/14 | 267733 |
| 11/25/14 | 306399 |
| 11/26/14 | 223511 |
| 11/27/14 | 208974 |
| 11/28/14 | 174038 |
| 12/1/14 | 154130 |
| 12/2/14 | 317686 |
| 12/3/14 | 314288 |
| 12/4/14 | 267244 |
| 12/5/14 | 456893 |
| 12/8/14 | 134059 |
| 12/9/14 | 333656 |
| 12/10/14 | 300934 |
| 12/11/14 | 117875 |
| 12/12/14 | 247558 |
| 12/15/14 | 482889 |
| 12/16/14 | 449240 |
| 12/17/14 | 388413 |
| 12/18/14 | 225880 |
| 12/19/14 | 616937 |
| 12/22/14 | 196879 |
| 12/23/14 | 355525 |
| 12/29/14 | 108695 |
| 12/30/14 | 113568 |
| 1/2/15 | 87963 |
| 1/5/15 | 225571 |
| 1/6/15 | 281290 |
| 1/7/15 | 201243 |
| 1/8/15 | 537746 |
| 1/9/15 | 312971 |
| 1/12/15 | 189527 |
| 1/13/15 | 201993 |
| 1/14/15 | 384229 |
| 1/15/15 | 350209 |
| 1/16/15 | 213593 |
| 1/19/15 | 107875 |
| 1/20/15 | 385300 |
| 1/21/15 | 378147 |
| 1/22/15 | 557408 |
| 1/23/15 | 946355 |
| 1/26/15 | 522463 |
| 1/27/15 | 341407 |
| 1/28/15 | 430088 |
| 1/29/15 | 258603 |
| 1/30/15 | 285225 |
| 2/2/15 | 299776 |
| 2/3/15 | 355433 |
| 2/4/15 | 386836 |
| 2/5/15 | 383215 |
| 2/6/15 | 410513 |
| 2/9/15 | 205828 |
| 2/10/15 | 372654 |
| 2/11/15 | 401466 |
| 2/12/15 | 532547 |
| 2/13/15 | 279984 |
| 2/16/15 | 157775 |
| 2/17/15 | 138804 |
| 2/18/15 | 149230 |
| 2/19/15 | 263021 |
| 2/20/15 | 113928 |
| 2/23/15 | 364938 |
| 2/24/15 | 309706 |
| 2/25/15 | 646803 |
| 2/26/15 | 251374 |
| 2/27/15 | 131304 |
| 3/2/15 | 287322 |
| 3/3/15 | 488452 |
| 3/4/15 | 386424 |
| 3/5/15 | 523835 |
| 3/6/15 | 798846 |
| 3/9/15 | 488464 |
| 3/10/15 | 607413 |
| 3/11/15 | 499528 |
| 3/12/15 | 1379436 |
| 3/13/15 | 992257 |
| 3/16/15 | 712790 |
| 3/17/15 | 710079 |
| 3/18/15 | 776944 |
| 3/19/15 | 608669 |
| 3/20/15 | 3077585 |
| 3/23/15 | 387347 |
| 3/24/15 | 1231424 |
| 3/25/15 | 579778 |
| 3/26/15 | 929077 |
| 3/27/15 | 801533 |
| 3/30/15 | 742942 |
| 3/31/15 | 570431 |
| 4/1/15 | 732249 |
| 4/2/15 | 810963 |
| 4/7/15 | 774056 |
| 4/8/15 | 778747 |
| 4/9/15 | 1279432 |
| 4/10/15 | 999791 |
| 4/13/15 | 302721 |
| 4/14/15 | 763374 |
| 4/15/15 | 731727 |
| 4/16/15 | 430397 |
| 4/17/15 | 919517 |
| 4/20/15 | 489137 |
| 4/21/15 | 554981 |
| 4/22/15 | 400876 |
| 4/23/15 | 892698 |
| 4/24/15 | 683035 |
| 4/27/15 | 1086393 |
| 4/28/15 | 820835 |
| 4/29/15 | 1491872 |
| 4/30/15 | 908321 |
| 5/4/15 | 444346 |
| 5/5/15 | 697223 |
| 5/6/15 | 336929 |
| 5/7/15 | 535142 |
| 5/8/15 | 370590 |
| 5/11/15 | 252494 |
| 5/12/15 | 396939 |
| 5/13/15 | 317580 |
| 5/14/15 | 814267 |
| 5/15/15 | 943077 |
| 5/18/15 | 419178 |
| 5/19/15 | 411912 |
| 5/20/15 | 772842 |
| 5/21/15 | 498795 |
| 5/22/15 | 865233 |
| 5/25/15 | 359747 |
| 5/26/15 | 957349 |
| 5/27/15 | 455027 |
| 5/28/15 | 362426 |
| 5/29/15 | 562576 |
| 6/1/15 | 602991 |
| 6/2/15 | 487528 |
| 6/3/15 | 503144 |
| 6/4/15 | 351707 |
| 6/5/15 | 637950 |
| 6/8/15 | 683049 |
| 6/9/15 | 730200 |
| 6/10/15 | 318596 |
| 6/11/15 | 376214 |
| 6/12/15 | 535662 |
| 6/15/15 | 642396 |
| 6/16/15 | 584411 |
| 6/17/15 | 855268 |
| 6/18/15 | 1090163 |
| 6/19/15 | 1407203 |
| 6/22/15 | 832211 |
| 6/23/15 | 974541 |
| 6/24/15 | 618857 |
| 6/25/15 | 779566 |
| 6/26/15 | 933282 |
| 6/29/15 | 877769 |
| 6/30/15 | 693627 |
| 7/1/15 | 1042192 |
| 7/2/15 | 912820 |
| 7/3/15 | 457310 |
| 7/6/15 | 431450 |
| 7/7/15 | 468567 |
| 7/8/15 | 515386 |
| 7/9/15 | 333894 |
| 7/10/15 | 497957 |
| 7/13/15 | 658796 |
| 7/14/15 | 766959 |
| 7/15/15 | 526705 |
| 7/16/15 | 358621 |
| 7/17/15 | 412696 |
| 7/20/15 | 316170 |
| 7/21/15 | 741357 |
| 7/22/15 | 411110 |
| 7/23/15 | 720515 |
| 7/24/15 | 263325 |
| 7/27/15 | 257722 |
| 7/28/15 | 113783 |
| 7/29/15 | 236539 |
| 7/30/15 | 169094 |
| 7/31/15 | 522664 |
| 8/3/15 | 197375 |
| 8/4/15 | 179585 |
| 8/5/15 | 347398 |
| 8/6/15 | 186602 |
| 8/7/15 | 226189 |
| 8/10/15 | 179569 |
| 8/11/15 | 228645 |
| 8/12/15 | 543599 |
| 8/13/15 | 344952 |
| 8/14/15 | 240177 |
| 8/17/15 | 408676 |
| 8/18/15 | 483358 |
| 8/19/15 | 261094 |
| 8/20/15 | 206528 |
| 8/21/15 | 527384 |
| 8/24/15 | 881556 |
| 8/25/15 | 593801 |
| 8/26/15 | 386624 |
| 8/27/15 | 494734 |
| 8/28/15 | 268640 |
| 8/31/15 | 179135 |
| 9/1/15 | 574563 |
| 9/2/15 | 207778 |
| 9/3/15 | 338426 |
| 9/4/15 | 520425 |
| 9/7/15 | 164973 |
| 9/8/15 | 281480 |
| 9/9/15 | 176855 |
| 9/10/15 | 353875 |
| 9/11/15 | 97868 |
| 9/14/15 | 282776 |
| 9/15/15 | 234404 |
| 9/16/15 | 807982 |
| 9/17/15 | 457441 |
| 9/18/15 | 339609 |
| 9/21/15 | 246319 |
| 9/22/15 | 441861 |
| 9/23/15 | 175591 |
| 9/24/15 | 264220 |
| 9/25/15 | 349683 |
| 9/28/15 | 237307 |
| 9/29/15 | 937706 |
| 9/30/15 | 601235 |
| 10/1/15 | 430908 |
| 10/2/15 | 206830 |
| 10/5/15 | 251317 |
| 10/6/15 | 184644 |
| 10/7/15 | 274725 |
| 10/8/15 | 272832 |
| 10/9/15 | 173842 |
| 10/12/15 | 388901 |
| 10/13/15 | 361342 |
| 10/14/15 | 187410 |
| 10/15/15 | 298037 |
| 10/16/15 | 394462 |
| 10/19/15 | 131004 |
| 10/20/15 | 118466 |
| 10/21/15 | 384417 |
| 10/22/15 | 657778 |
| 10/23/15 | 363990 |
| 10/26/15 | 350264 |
| 10/27/15 | 624144 |
| 10/28/15 | 653075 |
| 10/29/15 | 334279 |
| 10/30/15 | 197810 |
| 11/2/15 | 357716 |
| 11/3/15 | 480688 |
| 11/4/15 | 341132 |
| 11/5/15 | 424309 |
| 11/6/15 | 538793 |
| 11/9/15 | 430087 |
| 11/10/15 | 794743 |
| 11/11/15 | 370459 |
| 11/12/15 | 618776 |
| 11/13/15 | 427078 |
| 11/16/15 | 800204 |
| 11/17/15 | 458177 |
| 11/18/15 | 301037 |
| 11/19/15 | 422158 |
| 11/20/15 | 454060 |
| 11/23/15 | 304077 |
| 11/24/15 | 546090 |
| 11/25/15 | 298537 |
| 11/26/15 | 292184 |
| 11/27/15 | 319727 |
| 11/30/15 | 347747 |
| 12/1/15 | 522740 |
| 12/2/15 | 378218 |
| 12/3/15 | 539543 |
| 12/4/15 | 179355 |
| 12/7/15 | 276571 |
| 12/8/15 | 292569 |
| 12/9/15 | 455262 |
| 12/10/15 | 360007 |
| 12/11/15 | 358454 |
| 12/14/15 | 776469 |
| 12/15/15 | 527284 |
| 12/16/15 | 336292 |
| 12/17/15 | 700536 |
| 12/18/15 | 523355 |
| 12/21/15 | 226223 |
| 12/22/15 | 137146 |
| 12/23/15 | 466210 |
| 12/28/15 | 191453 |
| 12/29/15 | 384384 |
| 12/30/15 | 350976 |
| 1/4/16 | 451345 |
| 1/5/16 | 440396 |
| 1/6/16 | 218382 |
| 1/7/16 | 474740 |
| 1/8/16 | 266150 |
| 1/11/16 | 427444 |
| 1/12/16 | 783060 |
| 1/13/16 | 417669 |
| 1/14/16 | 297530 |
| 1/15/16 | 543483 |
| 1/18/16 | 424328 |
| 1/19/16 | 687480 |
| 1/20/16 | 479185 |
| 1/21/16 | 725312 |
| 1/22/16 | 371793 |
| 1/25/16 | 947124 |
| 1/26/16 | 411176 |
| 1/27/16 | 600868 |
| 1/28/16 | 1021405 |
| 1/29/16 | 582871 |
| 2/1/16 | 572689 |
| 2/2/16 | 558812 |
| 2/3/16 | 834500 |
| 2/4/16 | 451198 |
| 2/5/16 | 1324118 |
| 2/8/16 | 924381 |
| 2/9/16 | 1064948 |
| 2/10/16 | 835854 |
| 2/11/16 | 835554 |
| 2/12/16 | 593898 |
| 2/15/16 | 371988 |
| 2/16/16 | 217925 |
| 2/17/16 | 490954 |
| 2/18/16 | 448620 |
| 2/19/16 | 274305 |
| 2/22/16 | 385743 |
| 2/23/16 | 683710 |
| 2/24/16 | 315736 |
| 2/25/16 | 311262 |
| 2/26/16 | 874830 |
| 2/29/16 | 254135 |
| 3/1/16 | 1002896 |
| 3/2/16 | 843628 |
| 3/3/16 | 667068 |
| 3/4/16 | 604244 |
| 3/7/16 | 274656 |
| 3/8/16 | 407796 |
| 3/9/16 | 284192 |
| 3/10/16 | 504411 |
| 3/11/16 | 323293 |
| 3/14/16 | 652773 |
| 3/15/16 | 644315 |
| 3/16/16 | 483204 |
| 3/17/16 | 726462 |
| 3/18/16 | 925935 |
| 3/21/16 | 546927 |
| 3/22/16 | 752003 |
| 3/23/16 | 690347 |
| 3/24/16 | 580125 |
| 3/29/16 | 524284 |
| 3/30/16 | 556987 |
| 3/31/16 | 342251 |
| 4/1/16 | 633213 |
| 4/4/16 | 455549 |
| 4/5/16 | 326873 |
| 4/6/16 | 742370 |
| 4/7/16 | 338969 |
| 4/8/16 | 303230 |
| 4/11/16 | 529940 |
| 4/12/16 | 543235 |
| 4/13/16 | 348944 |
| 4/14/16 | 302701 |
| 4/15/16 | 240899 |
| 4/18/16 | 662872 |
| 4/19/16 | 336486 |
| 4/20/16 | 349648 |
| 4/21/16 | 307776 |
| 4/22/16 | 593772 |
| 4/25/16 | 311080 |
| 4/26/16 | 807773 |
| 4/27/16 | 384853 |
| 4/28/16 | 652900 |
| 4/29/16 | 397182 |
| 5/2/16 | 140568 |
| 5/3/16 | 678863 |
| 5/4/16 | 354930 |
| 5/5/16 | 221331 |
| 5/6/16 | 154423 |
| 5/9/16 | 133928 |
| 5/10/16 | 130837 |
| 5/11/16 | 297069 |
| 5/12/16 | 488489 |
| 5/13/16 | 207503 |
| 5/16/16 | 160141 |
| 5/17/16 | 362559 |
| 5/18/16 | 486121 |
| 5/19/16 | 402415 |
| 5/20/16 | 704502 |
| 5/23/16 | 369817 |
| 5/24/16 | 406943 |
| 5/25/16 | 179635 |
| 5/26/16 | 391630 |
| 5/27/16 | 201191 |
| 5/30/16 | 292083 |
| 5/31/16 | 355227 |
| 6/1/16 | 400355 |
| 6/2/16 | 222596 |
| 6/3/16 | 283350 |
| 6/6/16 | 161867 |
| 6/7/16 | 233416 |
| 6/8/16 | 330738 |
| 6/9/16 | 334131 |
| 6/10/16 | 481013 |
| 6/13/16 | 600303 |
| 6/14/16 | 285632 |
| 6/15/16 | 707798 |
| 6/16/16 | 932178 |
| 6/17/16 | 1104711 |
| 6/20/16 | 698519 |
| 6/21/16 | 674331 |
| 6/22/16 | 510205 |
| 6/23/16 | 447747 |
| 6/24/16 | 325999 |
| 6/27/16 | 944408 |
| 6/28/16 | 595889 |
| 6/29/16 | 495589 |
| 6/30/16 | 516937 |
| 7/1/16 | 693185 |
| 7/4/16 | 267728 |
| 7/5/16 | 267804 |
| 7/6/16 | 362493 |
| 7/7/16 | 233588 |
| 7/8/16 | 995134 |
| 7/11/16 | 803268 |
| 7/12/16 | 594089 |
| 7/13/16 | 501936 |
| 7/14/16 | 375705 |
| 7/15/16 | 446866 |
| 7/18/16 | 475713 |
| 7/19/16 | 300562 |
| 7/20/16 | 584623 |
| 7/21/16 | 623170 |
| 7/22/16 | 449444 |
| 7/25/16 | 358823 |
| 7/26/16 | 445964 |
| 7/27/16 | 691137 |
| 7/28/16 | 637313 |
| 7/29/16 | 622416 |
| 8/1/16 | 549580 |
| 8/2/16 | 408209 |
| 8/3/16 | 289919 |
| 8/4/16 | 184077 |
| 8/5/16 | 242425 |
| 8/8/16 | 253159 |
| 8/9/16 | 183075 |
| 8/10/16 | 320410 |
| 8/11/16 | 289755 |
| 8/12/16 | 347032 |
| 8/16/16 | 324842 |
| 8/17/16 | 333167 |
| 8/18/16 | 323858 |
| 8/19/16 | 210842 |
| 8/22/16 | 322165 |
| 8/23/16 | 702318 |
| 8/24/16 | 606021 |
| 8/25/16 | 227315 |
| 8/26/16 | 352320 |
| 8/29/16 | 283882 |
| 8/30/16 | 308076 |
| 8/31/16 | 230132 |
| 9/1/16 | 510979 |
| 9/2/16 | 342131 |
| 9/5/16 | 150017 |
| 9/6/16 | 129646 |
| 9/7/16 | 260735 |
| 9/8/16 | 293755 |
| 9/9/16 | 669998 |
| 9/12/16 | 325686 |
| 9/13/16 | 253959 |
| 9/14/16 | 473204 |
| 9/15/16 | 345304 |
| 9/16/16 | 308281 |
| 9/19/16 | 193543 |
| 9/20/16 | 558562 |
| 9/21/16 | 179320 |
| 9/22/16 | 83757 |
| 9/23/16 | 354260 |
| 9/26/16 | 425060 |
| 9/27/16 | 444045 |
| 9/28/16 | 342449 |
| 9/29/16 | 179346 |
| 9/30/16 | 552032 |
| 10/3/16 | 186559 |
| 10/4/16 | 635497 |
| 10/5/16 | 687672 |
| 10/6/16 | 208404 |
| 10/7/16 | 343238 |
| 10/10/16 | 273097 |
| 10/11/16 | 365736 |
| 10/12/16 | 358787 |
| 10/13/16 | 217047 |
| 10/14/16 | 360394 |
| 10/17/16 | 555938 |
| 10/18/16 | 694850 |
| 10/19/16 | 294223 |
| 10/20/16 | 140508 |
| 10/21/16 | 320035 |
| 10/24/16 | 154062 |
| 10/25/16 | 143894 |
| 10/26/16 | 321642 |
| 10/27/16 | 550737 |
| 10/28/16 | 199474 |
| 10/31/16 | 125025 |
| 11/1/16 | 206726 |
| 11/2/16 | 396955 |
| 11/3/16 | 491552 |
| 11/4/16 | 326982 |
| 11/7/16 | 444833 |
| 11/8/16 | 651389 |
| 11/9/16 | 1196443 |
| 11/10/16 | 525123 |
| 11/11/16 | 376050 |
| 11/14/16 | 664816 |
| 11/15/16 | 477629 |
| 11/16/16 | 473043 |
| 11/17/16 | 365315 |
| 11/18/16 | 390527 |
| 11/21/16 | 292755 |
| 11/22/16 | 449131 |
| 11/23/16 | 774864 |
| 11/24/16 | 683555 |
| 11/25/16 | 483891 |
| 11/28/16 | 466494 |
| 11/29/16 | 437385 |
| 11/30/16 | 646834 |
| 12/1/16 | 714826 |
| 12/2/16 | 521686 |
| 12/5/16 | 608363 |
| 12/6/16 | 934060 |
| 12/7/16 | 1702104 |
| 12/8/16 | 1077540 |
| 12/9/16 | 530543 |
| 12/12/16 | 749401 |
| 12/13/16 | 764025 |
| 12/14/16 | 386248 |
| 12/15/16 | 876899 |
| 12/16/16 | 861733 |
| 12/19/16 | 827939 |
| 12/20/16 | 608541 |
| 12/21/16 | 796737 |
| 12/22/16 | 687247 |
| 12/23/16 | 195660 |
| 12/27/16 | 84094 |
| 12/28/16 | 395962 |
| 12/29/16 | 313112 |
| 12/30/16 | 311857 |
| 1/2/17 | 127966 |
| 1/3/17 | 298086 |
| 1/4/17 | 822467 |
| 1/5/17 | 586408 |
| 1/6/17 | 105325 |
| 1/9/17 | 301252 |
| 1/10/17 | 576192 |
| 1/11/17 | 1076068 |
| 1/12/17 | 1248707 |
| 1/13/17 | 991788 |
| 1/16/17 | 492382 |
| 1/17/17 | 385369 |
| 1/18/17 | 420667 |
| 1/19/17 | 562873 |
| 1/20/17 | 651587 |
| 1/23/17 | 842240 |
| 1/24/17 | 773777 |
| 1/25/17 | 490343 |
| 1/26/17 | 470833 |
| 1/27/17 | 432732 |
| 1/30/17 | 498532 |
| 1/31/17 | 503661 |
| 2/1/17 | 754069 |
| 2/2/17 | 539273 |
| 2/3/17 | 483165 |
| 2/6/17 | 279207 |
| 2/7/17 | 942033 |
| 2/8/17 | 1450197 |
| 2/9/17 | 925671 |
| 2/10/17 | 844744 |
| 2/13/17 | 264950 |
| 2/14/17 | 686877 |
| 2/15/17 | 1371782 |
| 2/16/17 | 899651 |
| 2/17/17 | 248763 |
| 2/20/17 | 561451 |
| 2/21/17 | 915700 |
| 2/22/17 | 1005429 |
| 2/23/17 | 980998 |
| 2/24/17 | 770115 |
| 2/27/17 | 1030126 |
| 2/28/17 | 813636 |
| 3/1/17 | 559256 |
| 3/2/17 | 319042 |
| 3/3/17 | 301817 |
| 3/6/17 | 334225 |
| 3/7/17 | 519357 |
| 3/8/17 | 226950 |
| 3/9/17 | 528598 |
| 3/10/17 | 415691 |
| 3/13/17 | 733120 |
| 3/14/17 | 576478 |
| 3/15/17 | 593471 |
| 3/16/17 | 644631 |
| 3/17/17 | 666735 |
| 3/20/17 | 762688 |
| 3/21/17 | 620810 |
| 3/22/17 | 1033883 |
| 3/23/17 | 437912 |
| 3/24/17 | 851887 |
| 3/27/17 | 1104031 |
| 3/28/17 | 684195 |
| 3/29/17 | 953031 |
| 3/30/17 | 739040 |
| 3/31/17 | 1139938 |
| 4/3/17 | 568545 |
| 4/4/17 | 471603 |
| 4/5/17 | 499704 |
| 4/6/17 | 671266 |
| 4/7/17 | 576156 |
| 4/10/17 | 445327 |
| 4/11/17 | 477484 |
| 4/12/17 | 659335 |
| 4/13/17 | 285022 |
| 4/18/17 | 557341 |
| 4/19/17 | 355211 |
| 4/20/17 | 454869 |
| 4/21/17 | 221953 |
| 4/24/17 | 181658 |
| 4/25/17 | 572081 |
| 4/26/17 | 606645 |
| 4/27/17 | 395991 |
| 4/28/17 | 428008 |
| 5/2/17 | 515297 |
| 5/3/17 | 305077 |
| 5/4/17 | 709868 |
| 5/5/17 | 364046 |
| 5/8/17 | 313353 |
| 5/9/17 | 616386 |
| 5/10/17 | 521793 |
| 5/11/17 | 682986 |
| 5/12/17 | 329958 |
| 5/15/17 | 531166 |
| 5/16/17 | 420989 |
| 5/17/17 | 379961 |
| 5/18/17 | 536019 |
| 5/19/17 | 610270 |
| 5/22/17 | 388549 |
| 5/23/17 | 736843 |
| 5/24/17 | 611859 |
| 5/25/17 | 603420 |
| 5/26/17 | 559341 |
| 5/29/17 | 345091 |
| 5/30/17 | 391960 |
| 5/31/17 | 935784 |
| 6/1/17 | 1058567 |
| 6/2/17 | 373390 |
| 6/5/17 | 426554 |
| 6/6/17 | 1012087 |
| 6/7/17 | 377423 |
| 6/8/17 | 616631 |
| 6/9/17 | 738185 |
| 6/12/17 | 908155 |
| 6/13/17 | 960850 |
| 6/14/17 | 623701 |
| 6/15/17 | 775725 |
| 6/16/17 | 771102 |
| 6/19/17 | 261740 |
| 6/20/17 | 565506 |
| 6/21/17 | 445626 |
| 6/22/17 | 364715 |
| 6/23/17 | 818366 |
| 6/26/17 | 898278 |
| 6/27/17 | 785507 |
| 6/28/17 | 1331028 |
| 6/29/17 | 908394 |
| 6/30/17 | 413960 |
| 7/3/17 | 610632 |
| 7/4/17 | 557317 |
| 7/5/17 | 706280 |
| 7/6/17 | 1103509 |
| 7/7/17 | 694746 |
| 7/10/17 | 326541 |
| 7/11/17 | 459359 |
| 7/12/17 | 763403 |
| 7/13/17 | 305842 |
| 7/14/17 | 915143 |
| 7/17/17 | 188663 |
| 7/18/17 | 581983 |
| 7/19/17 | 484256 |
| 7/20/17 | 329204 |
| 7/21/17 | 711548 |
| 7/24/17 | 1165400 |
| 7/25/17 | 836318 |
| 7/26/17 | 810716 |
| 7/27/17 | 891569 |
| 7/28/17 | 652817 |
| 7/31/17 | 615744 |
| 8/1/17 | 801098 |
| 8/2/17 | 553026 |
| 8/3/17 | 833834 |
| 8/4/17 | 674538 |
| 8/7/17 | 272773 |
| 8/8/17 | 512238 |
| 8/9/17 | 569825 |
| 8/10/17 | 419380 |
| 8/11/17 | 697865 |
| 8/14/17 | 664873 |
| 8/16/17 | 618314 |
| 8/17/17 | 415333 |
| 8/18/17 | 558430 |
| 8/21/17 | 327914 |
| 8/22/17 | 678163 |
| 8/23/17 | 489728 |
| 8/24/17 | 670371 |
| 8/25/17 | 389770 |
| 8/28/17 | 605871 |
| 8/29/17 | 1026380 |
| 8/30/17 | 792592 |
| 8/31/17 | 677733 |
| 9/1/17 | 376646 |
| 9/4/17 | 97472 |
| 9/5/17 | 219771 |
| 9/6/17 | 320787 |
| 9/7/17 | 425747 |
| 9/8/17 | 471380 |
| 9/11/17 | 706179 |
| 9/12/17 | 993872 |
| 9/13/17 | 638058 |
| 9/14/17 | 800595 |
| 9/15/17 | 806514 |
| 9/18/17 | 555217 |
| 9/19/17 | 364584 |
| 9/20/17 | 368231 |
| 9/21/17 | 359731 |
| 9/22/17 | 549228 |
| 9/25/17 | 318597 |
| 9/26/17 | 426159 |
| 9/27/17 | 398014 |
| 9/28/17 | 501969 |
| 9/29/17 | 353100 |
| 10/2/17 | 579415 |
| 10/3/17 | 184062 |
| 10/4/17 | 552459 |
| 10/5/17 | 446561 |
| 10/6/17 | 437415 |
| 10/9/17 | 514513 |
| 10/10/17 | 598546 |
| 10/11/17 | 791085 |
| 10/12/17 | 469554 |
| 10/13/17 | 262091 |
| 10/16/17 | 396251 |
| 10/17/17 | 502875 |
| 10/18/17 | 256252 |
| 10/19/17 | 400529 |
| 10/20/17 | 701588 |
| 10/23/17 | 206557 |
| 10/24/17 | 240784 |
| 10/25/17 | 304553 |
| 10/26/17 | 378344 |
| 10/27/17 | 378615 |
| 10/30/17 | 159388 |
| 10/31/17 | 407884 |
| 11/1/17 | 433454 |
| 11/2/17 | 1154368 |
| 11/3/17 | 537208 |
| 11/6/17 | 720991 |
| 11/7/17 | 640432 |
| 11/8/17 | 870765 |
| 11/9/17 | 937949 |
| 11/10/17 | 989473 |
| 11/13/17 | 459135 |
| 11/14/17 | 1011695 |
| 11/15/17 | 281844 |
| 11/16/17 | 581958 |
| 11/17/17 | 789503 |
| 11/20/17 | 477977 |
| 11/21/17 | 611662 |
| 11/22/17 | 476290 |
| 11/23/17 | 233227 |
| 11/24/17 | 466513 |
| 11/27/17 | 383240 |
| 11/28/17 | 260663 |
| 11/29/17 | 496640 |
| 11/30/17 | 289369 |
| 12/1/17 | 491277 |
| 12/4/17 | 338880 |
| 12/5/17 | 283023 |
| 12/6/17 | 525820 |
| 12/7/17 | 307975 |
| 12/8/17 | 661472 |
| 12/11/17 | 289326 |
| 12/12/17 | 358708 |
| 12/13/17 | 470189 |
| 12/14/17 | 366835 |
| 12/15/17 | 486795 |
| 12/18/17 | 631144 |
| 12/19/17 | 445305 |
| 12/20/17 | 278611 |
| 12/21/17 | 518832 |
| 12/22/17 | 239725 |
| 12/27/17 | 439445 |
| 12/28/17 | 254273 |
| 12/29/17 | 294461 |
| 1/2/18 | 161042 |
| 1/3/18 | 691910 |
| 1/4/18 | 253534 |
| 1/5/18 | 429606 |
| 1/8/18 | 560334 |
| 1/9/18 | 919716 |
| 1/10/18 | 1009953 |
| 1/11/18 | 1068867 |
| 1/12/18 | 576454 |
| 1/15/18 | 477340 |
| 1/16/18 | 830890 |
| 1/17/18 | 648091 |
| 1/18/18 | 570382 |
| 1/19/18 | 760105 |
| 1/22/18 | 463197 |
| 1/23/18 | 687332 |
| 1/24/18 | 661894 |
| 1/25/18 | 441725 |
| 1/26/18 | 714889 |
| 1/29/18 | 589934 |
| 1/30/18 | 1621250 |
| 1/31/18 | 811136 |
| 2/1/18 | 524890 |
| 2/2/18 | 718520 |
| 2/5/18 | 1449725 |
| 2/6/18 | 1156030 |
| 2/7/18 | 980992 |
| 2/8/18 | 661532 |
| 2/9/18 | 1229388 |
| 2/12/18 | 666105 |
| 2/13/18 | 984069 |
| 2/14/18 | 722511 |
| 2/15/18 | 370359 |
| 2/16/18 | 291279 |
| 2/19/18 | 377469 |
| 2/20/18 | 430844 |
| 2/21/18 | 660837 |
| 2/22/18 | 974617 |
| 2/23/18 | 893797 |
| 2/26/18 | 541235 |
| 2/27/18 | 783402 |
| 2/28/18 | 541175 |
| 3/1/18 | 1138223 |
| 3/2/18 | 414570 |
| 3/5/18 | 592831 |
| 3/6/18 | 800219 |
| 3/7/18 | 568544 |
| 3/8/18 | 657256 |
| 3/9/18 | 633367 |
| 3/12/18 | 337039 |
| 3/13/18 | 550245 |
| 3/14/18 | 623747 |
| 3/15/18 | 265828 |
| 3/16/18 | 114673 |
| 3/19/18 | 518259 |
| 3/20/18 | 529377 |
| 3/21/18 | 294801 |
| 3/22/18 | 560734 |
| 3/23/18 | 775807 |
| 3/26/18 | 560055 |
| 3/27/18 | 506075 |
| 3/28/18 | 2664421 |
| 3/29/18 | 684087 |
| 4/3/18 | 475759 |
| 4/4/18 | 783897 |
| 4/5/18 | 780695 |
| 4/6/18 | 956907 |
| 4/9/18 | 565409 |
| 4/10/18 | 1239967 |
| 4/11/18 | 1029800 |
| 4/12/18 | 515136 |
| 4/13/18 | 509490 |
| 4/16/18 | 715464 |
| 4/17/18 | 1043084 |
| 4/18/18 | 476230 |
| 4/19/18 | 942989 |
| 4/20/18 | 528387 |
| 4/23/18 | 397931 |
| 4/24/18 | 1060313 |
| 4/25/18 | 210332 |
| 4/26/18 | 382195 |
| 4/27/18 | 367910 |
| 4/30/18 | 382799 |
| 5/2/18 | 611283 |
| 5/3/18 | 497576 |
| 5/4/18 | 268015 |
| 5/7/18 | 358667 |
| 5/8/18 | 752645 |
| 5/9/18 | 426613 |
| 5/10/18 | 634356 |
| 5/11/18 | 277601 |
| 5/14/18 | 511598 |
| 5/15/18 | 359056 |
| 5/16/18 | 1601123 |
| 5/17/18 | 694064 |
| 5/18/18 | 766109 |
| 5/21/18 | 360795 |
| 5/22/18 | 904712 |
| 5/23/18 | 445480 |
| 5/24/18 | 490545 |
| 5/25/18 | 638121 |
| 5/28/18 | 297854 |
| 5/29/18 | 960020 |
| 5/30/18 | 996952 |
| 5/31/18 | 550612 |
| 6/1/18 | 819246 |
| 6/4/18 | 505595 |
| 6/5/18 | 784099 |
| 6/6/18 | 547863 |
| 6/7/18 | 700721 |
| 6/8/18 | 462014 |
| 6/11/18 | 648237 |
| 6/12/18 | 459629 |
| 6/13/18 | 603257 |
| 6/14/18 | 798133 |
| 6/15/18 | 926035 |
| 6/18/18 | 307351 |
| 6/19/18 | 624642 |
| 6/20/18 | 482458 |
| 6/21/18 | 256211 |
| 6/22/18 | 775794 |
| 6/25/18 | 418642 |
| 6/26/18 | 260147 |
| 6/27/18 | 638501 |
| 6/28/18 | 636953 |
| 6/29/18 | 570664 |
| 7/2/18 | 223292 |
| 7/3/18 | 410992 |
| 7/4/18 | 128120 |
| 7/5/18 | 904463 |
| 7/6/18 | 309873 |
| 7/9/18 | 519622 |
| 7/10/18 | 520198 |
| 7/11/18 | 370009 |
| 7/12/18 | 194366 |
| 7/13/18 | 178123 |
| 7/16/18 | 415731 |
| 7/17/18 | 1083377 |
| 7/18/18 | 417973 |
| 7/19/18 | 367788 |
| 7/20/18 | 363148 |
| 7/23/18 | 359055 |
| 7/24/18 | 1118729 |
| 7/25/18 | 403590 |
| 7/26/18 | 760887 |
| 7/27/18 | 464694 |
| 7/30/18 | 680569 |
| 7/31/18 | 544702 |
| 8/1/18 | 390822 |
| 8/2/18 | 318170 |
| 8/3/18 | 367935 |
| 8/6/18 | 303958 |
| 8/7/18 | 415612 |
| 8/8/18 | 200131 |
| 8/9/18 | 265938 |
| 8/10/18 | 225475 |
| 8/13/18 | 127533 |
| 8/14/18 | 164747 |
| 8/16/18 | 269797 |
| 8/17/18 | 109020 |
| 8/20/18 | 125372 |
| 8/21/18 | 1167108 |
| 8/22/18 | 395217 |
| 8/23/18 | 602080 |
| 8/24/18 | 315853 |
| 8/27/18 | 111592 |
| 8/28/18 | 2380775 |
| 8/29/18 | 596894 |
| 8/30/18 | 1129649 |
| 8/31/18 | 496645 |
| 9/3/18 | 613223 |
| 9/4/18 | 728705 |
| 9/5/18 | 126288 |
| 9/6/18 | 193112 |
| 9/7/18 | 607865 |
| 9/10/18 | 299979 |
| 9/11/18 | 661387 |
| 9/12/18 | 335612 |
| 9/13/18 | 172452 |
| 9/14/18 | 224453 |
| 9/17/18 | 567107 |
| 9/18/18 | 669039 |
| 9/19/18 | 124636 |
| 9/20/18 | 176107 |
| 9/21/18 | 199943 |
| 9/24/18 | 140366 |
| 9/25/18 | 184680 |
| 9/26/18 | 263875 |
| 9/27/18 | 429504 |
| 9/28/18 | 232930 |
| 10/1/18 | 250034 |
| 10/2/18 | 390344 |
| 10/3/18 | 211498 |
| 10/4/18 | 260542 |
| 10/5/18 | 284606 |
| 10/8/18 | 478275 |
| 10/9/18 | 959333 |
| 10/10/18 | 354572 |
| 10/11/18 | 936019 |
| 10/12/18 | 337155 |
| 10/15/18 | 584957 |
| 10/16/18 | 570631 |
| 10/17/18 | 709686 |
| 10/18/18 | 1201229 |
| 10/19/18 | 971584 |
| 10/22/18 | 172634 |
| 10/23/18 | 561360 |
| 10/24/18 | 551023 |
| 10/25/18 | 684574 |
| 10/26/18 | 155172 |
| 10/29/18 | 521845 |
| 10/30/18 | 380484 |
| 10/31/18 | 250186 |
| 11/1/18 | 85526 |
| 11/2/18 | 205989 |
| 11/5/18 | 185311 |
| 11/6/18 | 247285 |
| 11/7/18 | 192323 |
| 11/8/18 | 251838 |
| 11/9/18 | 666238 |
| 11/12/18 | 176187 |
| 11/13/18 | 410225 |
| 11/14/18 | 306799 |
| 11/15/18 | 299400 |
| 11/16/18 | 165059 |
| 11/19/18 | 393850 |
| 11/20/18 | 641808 |
| 11/21/18 | 507555 |
| 11/22/18 | 128128 |
| 11/23/18 | 191219 |
| 11/26/18 | 416958 |
| 11/27/18 | 231163 |
| 11/28/18 | 191467 |
| 11/29/18 | 386198 |
| 11/30/18 | 143027 |
| 12/3/18 | 143500 |
| 12/4/18 | 303759 |
| 12/5/18 | 125272 |
| 12/6/18 | 300632 |
| 12/7/18 | 177028 |
| 12/10/18 | 245095 |
| 12/11/18 | 359408 |
| 12/12/18 | 271335 |
| 12/13/18 | 1067475 |
| 12/14/18 | 1132715 |
| 12/17/18 | 517721 |
| 12/18/18 | 585580 |
| 12/19/18 | 332596 |
| 12/20/18 | 105683 |
| 12/21/18 | 216375 |
| 12/27/18 | 328038 |
| 12/28/18 | 219473 |
| 1/2/19 | 905398 |
| 1/3/19 | 565809 |
| 1/4/19 | 1153416 |
| 1/7/19 | 1135860 |
| 1/8/19 | 727940 |
| 1/9/19 | 750405 |
| 1/10/19 | 987835 |
| 1/11/19 | 1331928 |
| 1/14/19 | 833105 |
| 1/15/19 | 802735 |
| 1/16/19 | 1069132 |
| 1/17/19 | 623829 |
| 1/18/19 | 647709 |
| 1/21/19 | 562661 |
| 1/22/19 | 429141 |
| 1/23/19 | 487373 |
| 1/24/19 | 353936 |
| 1/25/19 | 319651 |
| 1/28/19 | 1038999 |
| 1/29/19 | 544370 |
| 1/30/19 | 613429 |
| 1/31/19 | 994983 |
| 2/1/19 | 964613 |
| 2/4/19 | 1021429 |
| 2/5/19 | 728403 |
| 2/6/19 | 530596 |
| 2/7/19 | 1569839 |
| 2/8/19 | 842987 |
| 2/11/19 | 1252560 |
| 2/12/19 | 755695 |
| 2/13/19 | 1293293 |
| 2/14/19 | 858767 |
| 2/15/19 | 1019355 |
| 2/18/19 | 809351 |
| 2/19/19 | 699377 |
| 2/20/19 | 1087190 |
| 2/21/19 | 892706 |
| 2/22/19 | 856012 |
| 2/25/19 | 873423 |
| 2/26/19 | 953227 |
| 2/27/19 | 930934 |
| 2/28/19 | 1196437 |
| 3/1/19 | 1287811 |
| 3/4/19 | 437998 |
| 3/5/19 | 834040 |
| 3/6/19 | 487962 |
| 3/7/19 | 1139819 |
| 3/8/19 | 1153942 |
| 3/11/19 | 1685584 |
| 3/12/19 | 890505 |
| 3/13/19 | 1880728 |
| 3/14/19 | 1036268 |
| 3/15/19 | 2505719 |
| 3/18/19 | 1036686 |
| 3/19/19 | 617739 |
| 3/20/19 | 1218129 |
| 3/21/19 | 579697 |
| 3/22/19 | 565465 |
| 3/25/19 | 1428515 |
| 3/26/19 | 967410 |
| 3/27/19 | 1680977 |
| 3/28/19 | 1422675 |
| 3/29/19 | 1541264 |
| 4/1/19 | 1565266 |
| 4/2/19 | 1215913 |
| 4/3/19 | 1229359 |
| 4/4/19 | 837813 |
| 4/5/19 | 810115 |
| 4/8/19 | 639692 |
| 4/9/19 | 727082 |
| 4/10/19 | 635474 |
| 4/11/19 | 499724 |
| 4/12/19 | 947905 |
| 4/15/19 | 481782 |
| 4/16/19 | 758497 |
| 4/17/19 | 519265 |
| 4/18/19 | 263818 |
| 4/23/19 | 644504 |
| 4/24/19 | 236218 |
| 4/25/19 | 798819 |
| 4/26/19 | 534158 |
| 4/29/19 | 430617 |
| 4/30/19 | 695608 |
| 5/2/19 | 817580 |
| 5/3/19 | 599690 |
| 5/6/19 | 378081 |
| 5/7/19 | 331597 |
| 5/8/19 | 430856 |
| 5/9/19 | 533729 |
| 5/10/19 | 556577 |
| 5/13/19 | 1207786 |
| 5/14/19 | 739017 |
| 5/15/19 | 373293 |
| 5/16/19 | 304594 |
| 5/17/19 | 289199 |
| 5/20/19 | 602108 |
| 5/21/19 | 722984 |
| 5/22/19 | 574602 |
| 5/23/19 | 437074 |
| 5/24/19 | 1773692 |
| 5/27/19 | 413206 |
| 5/28/19 | 429223 |
| 5/29/19 | 741856 |
| 5/30/19 | 678126 |
| 5/31/19 | 431326 |
| 6/3/19 | 1138526 |
| 6/4/19 | 1313929 |
| 6/5/19 | 1117251 |
| 6/6/19 | 729236 |
| 6/7/19 | 612773 |
| 6/10/19 | 301719 |
| 6/11/19 | 1551809 |
| 6/12/19 | 594520 |
| 6/13/19 | 406011 |
| 6/14/19 | 398789 |
| 6/17/19 | 685958 |
| 6/18/19 | 1758944 |
| 6/19/19 | 993136 |
| 6/20/19 | 523501 |
| 6/21/19 | 987385 |
| 6/24/19 | 1047505 |
| 6/25/19 | 839686 |
| 6/26/19 | 438057 |
| 6/27/19 | 646997 |
| 6/28/19 | 460097 |
| 7/1/19 | 951111 |
| 7/2/19 | 1287214 |
| 7/3/19 | 507824 |
| 7/4/19 | 407511 |
| 7/5/19 | 696986 |
| 7/8/19 | 660065 |
| 7/9/19 | 421053 |
| 7/10/19 | 301021 |
| 7/11/19 | 701718 |
| 7/12/19 | 525417 |
| 7/15/19 | 713930 |
| 7/16/19 | 560997 |
| 7/17/19 | 893368 |
| 7/18/19 | 752794 |
| 7/19/19 | 557362 |
| 7/22/19 | 393832 |
| 7/23/19 | 257794 |
| 7/24/19 | 225391 |
| 7/25/19 | 404637 |
| 7/26/19 | 411163 |
| 7/29/19 | 529711 |
| 7/30/19 | 738459 |
| 7/31/19 | 1016220 |
| 8/1/19 | 450265 |
| 8/2/19 | 170799 |
| 8/5/19 | 321736 |
| 8/6/19 | 510454 |
| 8/7/19 | 641714 |
| 8/8/19 | 348665 |
| 8/9/19 | 382498 |
| 8/12/19 | 264587 |
| 8/13/19 | 314397 |
| 8/14/19 | 357983 |
| 8/16/19 | 537696 |
| 8/19/19 | 240875 |
| 8/20/19 | 509474 |
| 8/21/19 | 285714 |
| 8/22/19 | 565849 |
| 8/23/19 | 828691 |
| 8/26/19 | 569034 |
| 8/27/19 | 616216 |
| 8/28/19 | 618248 |
| 8/29/19 | 592289 |
| 8/30/19 | 468737 |
| 9/2/19 | 139035 |
| 9/3/19 | 288144 |
| 9/4/19 | 496667 |
| 9/5/19 | 413899 |
| 9/6/19 | 353153 |
| 9/9/19 | 283741 |
| 9/10/19 | 880615 |
| 9/11/19 | 713162 |
| 9/12/19 | 387384 |
| 9/13/19 | 329848 |
| 9/16/19 | 201935 |
| 9/17/19 | 228488 |
| 9/18/19 | 422731 |
| 9/19/19 | 513076 |
| 9/20/19 | 175569 |
| 9/23/19 | 105146 |
| 9/24/19 | 486599 |
| 9/25/19 | 530030 |
| 9/26/19 | 348767 |
| 9/27/19 | 720120 |
| 9/30/19 | 518466 |
| 10/1/19 | 399512 |
| 10/2/19 | 629359 |
| 10/3/19 | 354937 |
| 10/4/19 | 590465 |
| 10/7/19 | 280248 |
| 10/8/19 | 137014 |
| 10/9/19 | 313851 |
| 10/10/19 | 205936 |
| 10/11/19 | 264273 |
| 10/14/19 | 106694 |
| 10/15/19 | 415644 |
| 10/16/19 | 416348 |
| 10/17/19 | 807841 |
| 10/18/19 | 297727 |
| 10/21/19 | 175238 |
| 10/22/19 | 130501 |
| 10/23/19 | 343080 |
| 10/24/19 | 212054 |
| 10/25/19 | 84238 |
| 10/28/19 | 125358 |
| 10/29/19 | 165441 |
| 10/30/19 | 202871 |
| 10/31/19 | 226971 |
| 11/1/19 | 78181 |
| 11/4/19 | 182964 |
| 11/5/19 | 281612 |
| 11/6/19 | 249972 |
| 11/7/19 | 417837 |
| 11/8/19 | 431731 |
| 11/11/19 | 350172 |
| 11/12/19 | 173443 |
| 11/13/19 | 396772 |
| 11/14/19 | 400061 |
| 11/15/19 | 339304 |
| 11/18/19 | 365121 |
| 11/19/19 | 327233 |
| 11/20/19 | 311586 |
| 11/21/19 | 169812 |
| 11/22/19 | 211744 |
| 11/25/19 | 78131 |
| 11/26/19 | 153504 |
| 11/27/19 | 143922 |
| 11/28/19 | 148556 |
| 11/29/19 | 110120 |
| 12/2/19 | 420308 |
| 12/3/19 | 157963 |
| 12/4/19 | 214951 |
| 12/5/19 | 557892 |
| 12/6/19 | 199391 |
| 12/9/19 | 396212 |
| 12/10/19 | 166551 |
| 12/11/19 | 292716 |
| 12/12/19 | 171826 |
| 12/13/19 | 326352 |
| 12/16/19 | 265903 |
| 12/17/19 | 340142 |
| 12/18/19 | 543750 |
| 12/19/19 | 204319 |
| 12/20/19 | 257367 |
| 12/23/19 | 124941 |
| 12/27/19 | 370099 |
| 12/30/19 | 172616 |
| 1/2/20 | 111242 |
| 1/3/20 | 209393 |
| 1/6/20 | 183774 |
| 1/7/20 | 206801 |
| 1/8/20 | 211717 |
| 1/9/20 | 526712 |
| 1/10/20 | 334025 |
| 1/13/20 | 821506 |
| 1/14/20 | 495478 |
| 1/15/20 | 513519 |
| 1/16/20 | 227231 |
| 1/17/20 | 340509 |
| 1/20/20 | 425132 |
| 1/21/20 | 503876 |
| 1/22/20 | 601433 |
| 1/23/20 | 515610 |
| 1/24/20 | 424514 |
| 1/27/20 | 358495 |
| 1/28/20 | 455906 |
| 1/29/20 | 369735 |
| 1/30/20 | 289460 |
| 1/31/20 | 286491 |
| 2/3/20 | 371071 |
| 2/4/20 | 442396 |
| 2/5/20 | 819511 |
| 2/6/20 | 401982 |
| 2/7/20 | 181299 |
| 2/10/20 | 104379 |
| 2/11/20 | 255147 |
| 2/12/20 | 245075 |
| 2/13/20 | 408052 |
| 2/14/20 | 166689 |
| 2/17/20 | 297696 |
| 2/18/20 | 412795 |
| 2/19/20 | 460384 |
| 2/20/20 | 240148 |
| 2/21/20 | 191176 |
| 2/24/20 | 428274 |
| 2/25/20 | 301990 |
| 2/26/20 | 186342 |
| 2/27/20 | 271267 |
| 2/28/20 | 483700 |
| 3/2/20 | 341147 |
| 3/3/20 | 851045 |
| 3/4/20 | 520016 |
| 3/5/20 | 666030 |
| 3/6/20 | 577617 |
| 3/9/20 | 575810 |
| 3/10/20 | 1442436 |
| 3/11/20 | 1159501 |
| 3/12/20 | 1309705 |
| 3/13/20 | 1293427 |
| 3/16/20 | 1288170 |
| 3/17/20 | 1400615 |
| 3/18/20 | 790096 |
| 3/19/20 | 1325848 |
| 3/20/20 | 421450 |
| 3/23/20 | 2522899 |
| 3/24/20 | 481489 |
| 3/25/20 | 669306 |
| 3/26/20 | 537667 |
| 3/27/20 | 478714 |
| 3/30/20 | 500966 |
| 3/31/20 | 568664 |
| 4/1/20 | 225377 |
| 4/2/20 | 832049 |
| 4/3/20 | 79208 |
| 4/6/20 | 131052 |
| 4/7/20 | 539190 |
| 4/8/20 | 372133 |
| 4/9/20 | 354095 |
| 4/14/20 | 333379 |
| 4/15/20 | 296949 |
| 4/16/20 | 963751 |
| 4/17/20 | 195564 |
| 4/20/20 | 528212 |
| 4/21/20 | 172806 |
| 4/22/20 | 273623 |
| 4/23/20 | 383927 |
| 4/24/20 | 465745 |
| 4/27/20 | 368788 |
| 4/28/20 | 312618 |
| 4/29/20 | 191613 |
| 4/30/20 | 332343 |
| 5/4/20 | 371738 |
| 5/5/20 | 334559 |
| 5/6/20 | 1055827 |
| 5/7/20 | 749338 |
| 5/8/20 | 296895 |
| 5/11/20 | 461879 |
| 5/12/20 | 1003689 |
| 5/13/20 | 194980 |
| 5/14/20 | 311268 |
| 5/15/20 | 262256 |
| 5/18/20 | 168125 |
| 5/19/20 | 1191128 |
| 5/20/20 | 508175 |
| 5/21/20 | 385394 |
| 5/22/20 | 304979 |
| 5/25/20 | 403700 |
| 5/26/20 | 357473 |
| 5/27/20 | 629641 |
| 5/28/20 | 199523 |
| 5/29/20 | 513125 |
| 6/1/20 | 181836 |
| 6/2/20 | 296798 |
| 6/3/20 | 532420 |
| 6/4/20 | 700463 |
| 6/5/20 | 559228 |
| 6/8/20 | 819696 |
| 6/9/20 | 601665 |
| 6/10/20 | 773870 |
| 6/11/20 | 803232 |
| 6/12/20 | 234262 |
| 6/15/20 | 693714 |
| 6/16/20 | 482595 |
| 6/17/20 | 160514 |
| 6/18/20 | 175122 |
| 6/19/20 | 353247 |
| 6/22/20 | 138608 |
| 6/23/20 | 141290 |
| 6/24/20 | 262905 |
| 6/25/20 | 243343 |
| 6/26/20 | 444941 |
| 6/29/20 | 495470 |
| 6/30/20 | 751322 |
| 7/1/20 | 159311 |
| 7/2/20 | 168080 |
| 7/3/20 | 207327 |
| 7/6/20 | 238470 |
| 7/7/20 | 214876 |
| 7/8/20 | 582590 |
| 7/9/20 | 352281 |
| 7/10/20 | 259817 |
| 7/13/20 | 183837 |
| 7/14/20 | 187518 |
| 7/15/20 | 430471 |
| 7/16/20 | 304061 |
| 7/17/20 | 385390 |
| 7/20/20 | 211799 |
| 7/21/20 | 930976 |
| 7/22/20 | 725380 |
| 7/23/20 | 1182369 |
| 7/24/20 | 274115 |
| 7/27/20 | 201252 |
| 7/28/20 | 837349 |
| 7/29/20 | 692185 |
| 7/30/20 | 403415 |
| 7/31/20 | 902084 |
| 8/3/20 | 571980 |
| 8/4/20 | 784044 |
| 8/5/20 | 496591 |
| 8/6/20 | 418765 |
| 8/7/20 | 1164168 |
| 8/10/20 | 395849 |
| 8/11/20 | 1280381 |
| 8/12/20 | 355343 |
| 8/13/20 | 703439 |
| 8/14/20 | 300296 |
| 8/17/20 | 91765 |
| 8/18/20 | 271607 |
| 8/19/20 | 369638 |
| 8/20/20 | 671623 |
| 8/21/20 | 393874 |
| 8/24/20 | 207180 |
| 8/25/20 | 203534 |
| 8/26/20 | 459464 |
| 8/27/20 | 348017 |
| 8/28/20 | 783364 |
| 8/31/20 | 798359 |
| 9/1/20 | 168350 |
| 9/2/20 | 646771 |
| 9/3/20 | 617539 |
| 9/4/20 | 757068 |
| 9/7/20 | 333265 |
| 9/8/20 | 458522 |
| 9/9/20 | 493824 |
| 9/10/20 | 272495 |
| 9/11/20 | 226779 |
| 9/14/20 | 551364 |
| 9/15/20 | 346082 |
| 9/16/20 | 411918 |
| 9/17/20 | 218298 |
| 9/18/20 | 397454 |
| 9/21/20 | 544543 |
| 9/22/20 | 387824 |
| 9/23/20 | 408494 |
| 9/24/20 | 580431 |
| 9/25/20 | 254261 |
| 9/28/20 | 437129 |
| 9/29/20 | 230817 |
| 9/30/20 | 253231 |
| 10/1/20 | 499926 |
| 10/2/20 | 370852 |
| 10/5/20 | 367723 |
| 10/6/20 | 392564 |
| 10/7/20 | 458444 |
| 10/8/20 | 212673 |
| 10/9/20 | 328344 |
| 10/12/20 | 941836 |
| 10/13/20 | 800150 |
| 10/14/20 | 564498 |
| 10/15/20 | 939934 |
| 10/16/20 | 666394 |
| 10/19/20 | 310556 |
| 10/20/20 | 1109991 |
| 10/21/20 | 651660 |
| 10/22/20 | 243617 |
| 10/23/20 | 189562 |
| 10/26/20 | 493598 |
| 10/27/20 | 670843 |
| 10/28/20 | 868144 |
| 10/29/20 | 698607 |
| 10/30/20 | 283069 |
| 11/2/20 | 333305 |
| 11/3/20 | 516220 |
| 11/4/20 | 957440 |
| 11/5/20 | 724254 |
| 11/6/20 | 167307 |
| 11/9/20 | 1348285 |
| 11/10/20 | 416533 |
| 11/11/20 | 1131083 |
| 11/12/20 | 1732160 |
| 11/13/20 | 679150 |
| 11/16/20 | 1749664 |
| 11/17/20 | 981271 |
| 11/18/20 | 670115 |
| 11/19/20 | 694036 |
| 11/20/20 | 243260 |
| 11/23/20 | 386740 |
| 11/24/20 | 343560 |
| 11/25/20 | 749117 |
| 11/26/20 | 295181 |
| 11/27/20 | 1632632 |
| 11/30/20 | 579814 |
| 12/1/20 | 634899 |
| 12/2/20 | 544311 |
| 12/3/20 | 586476 |
| 12/4/20 | 355008 |
| 12/7/20 | 498850 |
| 12/8/20 | 273108 |
| 12/9/20 | 570465 |
| 12/10/20 | 349314 |
| 12/11/20 | 485226 |
| 12/14/20 | 1021992 |
| 12/15/20 | 385875 |
| 12/16/20 | 317224 |
| 12/17/20 | 976602 |
| 12/18/20 | 637412 |
| 12/21/20 | 304767 |
| 12/22/20 | 169946 |
| 12/23/20 | 143644 |
| 12/28/20 | 107845 |
| 12/29/20 | 180070 |
| 12/30/20 | 95869 |
| 1/4/21 | 56094 |
| 1/5/21 | 8878 |
| 1/8/21 | 54 |
| 1/18/21 | 136 |
| 1/19/21 | 15134 |
| 1/20/21 | 1 |
| 1/29/21 | 7001 |
| 2/15/21 | 551 |
| 2/16/21 | 465 |
| 2/24/21 | 345 |
| 3/1/21 | 8 |
| 3/5/21 | 27 |
| 3/18/21 | 1368 |
| 4/8/21 | 6909 |
| 6/7/21 | 31811 |
| 6/22/21 | 1254 |
| 6/23/21 | 542 |
| 6/24/21 | 1492 |
| 6/28/21 | 112 |
| 6/29/21 | 377 |
| 6/30/21 | 1242 |
| 7/7/21 | 1478 |
| 9/9/21 | 2380 |
| 9/10/21 | 1304 |
| 9/16/21 | 14 |
| 9/29/21 | 1350 |
| 10/8/21 | 1353 |
| 10/28/21 | 13753 |
| 11/1/21 | 2934 |
| 11/9/21 | 1 |
| 11/24/21 | 27 |
| 11/26/21 | 23 |
| 12/10/21 | 354 |
| 12/14/21 | 1418 |
| 12/23/21 | 212 |
| 12/29/21 | 57 |
| 1/13/22 | 2729 |
| 1/14/22 | 12947 |
| 1/18/22 | 74 |
| 1/19/22 | 465 |
| 2/4/22 | 194 |
| 2/21/22 | 428 |
| 2/22/22 | 926 |
| 2/23/22 | 507 |
| 2/24/22 | 1227 |
| 2/25/22 | 2569 |
| 3/2/22 | 7000 |
| 3/3/22 | 1847 |
| 3/4/22 | 11 |
| 3/7/22 | 3476 |
| 3/8/22 | 1161 |
| 3/10/22 | 1918 |
| 3/11/22 | 7597 |
| 3/14/22 | 192 |
| 3/15/22 | 752 |
| 3/18/22 | 183 |
| 3/23/22 | 7753 |
| 3/31/22 | 2392 |
| 4/1/22 | 216 |
| 4/5/22 | 803 |
| 4/6/22 | 423 |
| 4/7/22 | 1508 |
| 4/8/22 | 899 |
| 4/11/22 | 1191 |
| 4/12/22 | 19899 |
| 4/13/22 | 1316 |
| 4/14/22 | 2727 |
| 4/19/22 | 1370 |
| 4/20/22 | 1028 |
| 4/21/22 | 23 |
| 4/22/22 | 2004 |
| 4/25/22 | 152 |
| 5/4/22 | 430 |
| 5/10/22 | 250 |
| 5/17/22 | 205 |
| 5/30/22 | 601 |
| 5/31/22 | 24 |
| 6/1/22 | 14922 |
| 6/10/22 | 9327 |
| 6/22/22 | 900 |
| 6/23/22 | 968 |
| 7/15/22 | 9 |
| 8/2/22 | 0 |
| 8/11/22 | 314 |
| 9/8/22 | 1088 |
| 9/9/22 | 88 |
| 9/23/22 | 153 |
| 9/26/22 | 35 |
| 9/29/22 | 331 |
| 10/11/22 | 32 |
| 10/12/22 | 24 |
| 10/19/22 | 505 |
| 10/20/22 | 4475 |
| 10/28/22 | 9229 |
| 11/17/22 | 1105 |
| 11/18/22 | 71 |
| 11/22/22 | 185 |
| 12/1/22 | 1564 |
| 12/9/22 | 433 |
| 12/22/22 | 26 |
| 1/4/23 | 134 |
| 1/5/23 | 398 |
| 2/7/23 | 1874 |
| 2/13/23 | 48 |
| 2/20/23 | 179 |
| 2/21/23 | 44 |
| 2/27/23 | 1 |
| 3/1/23 | 199 |
| 3/2/23 | 227 |
| 3/7/23 | 473 |
| 3/27/23 | 176 |
| 4/4/23 | 61 |
| 4/25/23 | 4 |
| 5/10/23 | 1452 |
| 5/11/23 | 1464 |
| 5/12/23 | 3097 |
| 5/30/23 | 58 |
| 6/5/23 | 34 |
| 6/6/23 | 62 |
| 6/8/23 | 22 |
| 6/13/23 | 39 |
| 6/14/23 | 15 |
| 6/15/23 | 1 |
| 6/21/23 | 65 |
| 6/22/23 | 101 |
| 6/29/23 | 10 |
| 7/12/23 | 1 |